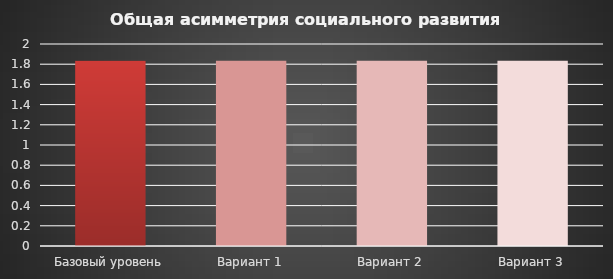
| Category | Series 0 |
|---|---|
| Базовый уровень | 1.835 |
| Вариант 1 | 1.835 |
| Вариант 2 | 1.835 |
| Вариант 3 | 1.835 |